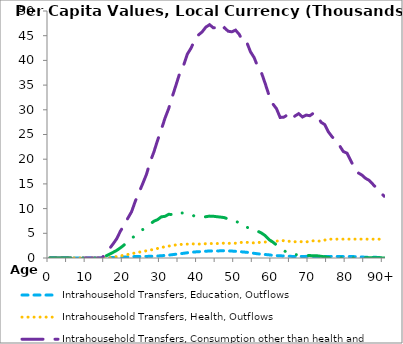
| Category | Intrahousehold Transfers, Education, Outflows | Intrahousehold Transfers, Health, Outflows | Intrahousehold Transfers, Consumption other than health and education, Outflows | Intrahousehold Transfers, Saving, Outflows |
|---|---|---|---|---|
| 0 | 0 | 0 | 0 | 0 |
|  | 0 | 0 | 0 | 0 |
| 2 | 0 | 0 | 0 | 0 |
| 3 | 0 | 0 | 0 | 0 |
| 4 | 0 | 0 | 0 | 0 |
| 5 | 0 | 0 | 0 | 0 |
| 6 | 0 | 0 | 0 | 0 |
| 7 | 0 | 0 | 0 | 0 |
| 8 | 0 | 0 | 0 | 0 |
| 9 | 0 | 0 | 0 | 0 |
| 10 | 0 | 0 | 0 | 0 |
| 11 | 0 | 0 | 0 | 0 |
| 12 | 0 | 0 | 0 | 0 |
| 13 | 0 | 0 | 0 | 0 |
| 14 | 0 | 0 | 0 | 0 |
| 15 | 25.876 | 0 | 876.297 | 374.466 |
| 16 | 65.819 | 9.939 | 1833.933 | 755.451 |
| 17 | 105.762 | 150.381 | 2826.049 | 1136.436 |
| 18 | 149.405 | 290.823 | 3902.925 | 1542.094 |
| 19 | 178.945 | 431.265 | 5445.746 | 2055.259 |
| 20 | 206.395 | 571.706 | 6654.384 | 2646.753 |
| 21 | 227.733 | 712.148 | 8058.849 | 3301.472 |
| 22 | 262.169 | 863.44 | 9364.429 | 3975.168 |
| 23 | 293.209 | 1023.13 | 11491.296 | 4528.904 |
| 24 | 304.692 | 1176.317 | 13257.892 | 5278.607 |
| 25 | 311.762 | 1311.933 | 15053.059 | 5755.5 |
| 26 | 323.142 | 1466.358 | 16911.415 | 6372.363 |
| 27 | 337.294 | 1602.256 | 19450.542 | 6829.844 |
| 28 | 363.692 | 1754.823 | 21446.199 | 7446.343 |
| 29 | 406.519 | 1930.392 | 23820.814 | 7758.614 |
| 30 | 452.935 | 2090.918 | 25977.415 | 8331.845 |
| 31 | 522.152 | 2295.925 | 28310.017 | 8434.673 |
| 32 | 588.389 | 2409.066 | 30259.281 | 8839.598 |
| 33 | 678.789 | 2529.128 | 32747.829 | 8808.024 |
| 34 | 769.829 | 2658.863 | 35097.084 | 9309.168 |
| 35 | 862.831 | 2723.071 | 37498.111 | 9055.361 |
| 36 | 954.645 | 2811.722 | 38974.135 | 9151.158 |
| 37 | 1059.432 | 2807.826 | 41258.79 | 8883.647 |
| 38 | 1136.028 | 2876.291 | 42468.564 | 8798.357 |
| 39 | 1224.231 | 2834.421 | 44112.226 | 8449.59 |
| 40 | 1273.942 | 2818.125 | 45139.554 | 8438.734 |
| 41 | 1316.341 | 2825.429 | 45776.53 | 8240.955 |
| 42 | 1372.571 | 2899.209 | 46739.834 | 8358.78 |
| 43 | 1417.791 | 2927.837 | 47232.183 | 8478.719 |
| 44 | 1415.587 | 2922.52 | 46602.377 | 8451.075 |
| 45 | 1431.227 | 2930.898 | 46639.596 | 8356.701 |
| 46 | 1448.338 | 2899.768 | 46007.393 | 8275.533 |
| 47 | 1477.709 | 3038.429 | 46623.795 | 8170.538 |
| 48 | 1437.322 | 2946.709 | 45905.888 | 7882.893 |
| 49 | 1402.142 | 3024.476 | 45785.744 | 7533.087 |
| 50 | 1349.776 | 2991.138 | 46127.159 | 7520.996 |
| 51 | 1310.64 | 3115.93 | 45254.84 | 7038.312 |
| 52 | 1218.63 | 3186.385 | 43750.47 | 6353.836 |
| 53 | 1160.77 | 3162.384 | 43695.621 | 6229.873 |
| 54 | 1055.162 | 3164.813 | 41763.85 | 5989.029 |
| 55 | 944.077 | 3035.666 | 40571.573 | 5808.26 |
| 56 | 848.064 | 3118.659 | 38670.252 | 5411.925 |
| 57 | 772.008 | 3213.046 | 37437.361 | 5036 |
| 58 | 703.311 | 3234.46 | 35264.906 | 4516.08 |
| 59 | 638.345 | 3432.832 | 32928.782 | 3720.117 |
| 60 | 533.48 | 3408.527 | 31221.071 | 3234.171 |
| 61 | 489.111 | 3423.415 | 30247.25 | 2649.806 |
| 62 | 435.448 | 3442.336 | 28448.679 | 2118.031 |
| 63 | 423.09 | 3528.174 | 28516.919 | 1531.732 |
| 64 | 378.298 | 3360.899 | 28980.413 | 1018.19 |
| 65 | 329.19 | 3411.685 | 28124.095 | 709.267 |
| 66 | 318.98 | 3285.037 | 28756.703 | 676.971 |
| 67 | 306.784 | 3340.491 | 29221.514 | 685.299 |
| 68 | 317.962 | 3271.899 | 28554.506 | 564.616 |
| 69 | 329.92 | 3249.768 | 28928.522 | 510.512 |
| 70 | 309.699 | 3372.96 | 28804.79 | 490.045 |
| 71 | 316.795 | 3481.542 | 29342.353 | 439.961 |
| 72 | 288.205 | 3452.498 | 28858.809 | 440.969 |
| 73 | 296.318 | 3394.657 | 27491.506 | 340.972 |
| 74 | 322.644 | 3628.827 | 27005.646 | 246.264 |
| 75 | 313.486 | 3817.281 | 25526.655 | 131.539 |
| 76 | 329.414 | 3817.281 | 24516.969 | 66.351 |
| 77 | 320.201 | 3817.281 | 23918.611 | 45.657 |
| 78 | 289.254 | 3817.281 | 22739.659 | 41.82 |
| 79 | 301.549 | 3817.281 | 21557.033 | 35.133 |
| 80 | 281.198 | 3817.281 | 21219.258 | 25.011 |
| 81 | 295.923 | 3817.281 | 19745.483 | 19.423 |
| 82 | 276.514 | 3817.281 | 18198.473 | 39.143 |
| 83 | 220.999 | 3817.281 | 17236.461 | 39.531 |
| 84 | 199.936 | 3817.281 | 16797.752 | 43.22 |
| 85 | 153.397 | 3817.281 | 16120.941 | 46.271 |
| 86 | 153.037 | 3817.281 | 15706.363 | 37.658 |
| 87 | 139.777 | 3817.281 | 14904.75 | 33.86 |
| 88 | 126.516 | 3817.281 | 14103.137 | 30.062 |
| 89 | 113.255 | 3817.281 | 13301.524 | 26.264 |
| 90+ | 99.995 | 3817.281 | 12499.911 | 22.466 |